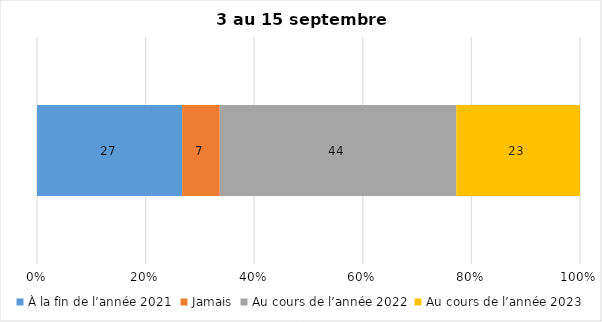
| Category | À la fin de l’année 2021 | Jamais | Au cours de l’année 2022 | Au cours de l’année 2023 |
|---|---|---|---|---|
| 0 | 27 | 7 | 44 | 23 |